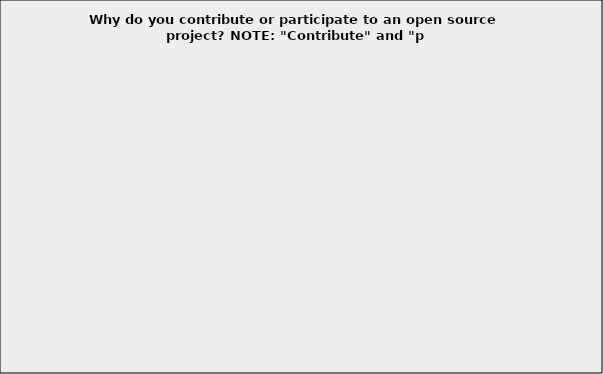
| Category | Series 0 |
|---|---|
| I'm paid to contribute | 0.084 |
| It is important for my career development and resume | 0.176 |
| I like to give back and support  open source projects | 0.469 |
| I enjoy the interaction with my peers working on the open source project | 0.226 |
| It is a great way to learn about new technologies | 0.356 |
| I needed a feature or bug fix in an open source project, so I did it myself | 0.329 |
| A good way to promote my consulting services | 0.058 |
| I believe in the FOSS ethos/philosophy | 0.33 |
| I don't contribute to any open source projects | 0.329 |